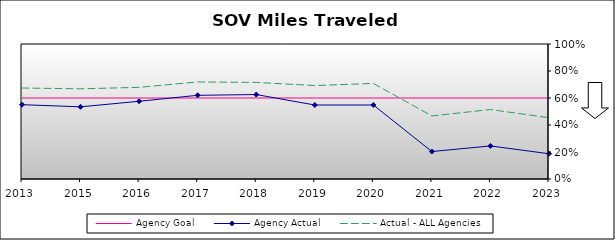
| Category | Agency Goal | Agency Actual | Actual - ALL Agencies |
|---|---|---|---|
| 2013.0 | 0.6 | 0.55 | 0.674 |
| 2015.0 | 0.6 | 0.535 | 0.668 |
| 2016.0 | 0.6 | 0.576 | 0.679 |
| 2017.0 | 0.6 | 0.62 | 0.719 |
| 2018.0 | 0.6 | 0.626 | 0.715 |
| 2019.0 | 0.6 | 0.548 | 0.692 |
| 2020.0 | 0.6 | 0.548 | 0.708 |
| 2021.0 | 0.6 | 0.203 | 0.467 |
| 2022.0 | 0.6 | 0.245 | 0.515 |
| 2023.0 | 0.6 | 0.187 | 0.454 |